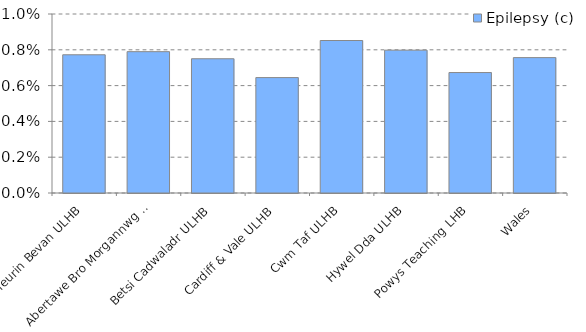
| Category | Epilepsy (c) |
|---|---|
| Aneurin Bevan ULHB | 0.008 |
| Abertawe Bro Morgannwg ULHB | 0.008 |
| Betsi Cadwaladr ULHB | 0.008 |
| Cardiff & Vale ULHB | 0.006 |
| Cwm Taf ULHB | 0.009 |
| Hywel Dda ULHB | 0.008 |
| Powys Teaching LHB | 0.007 |
| Wales | 0.008 |